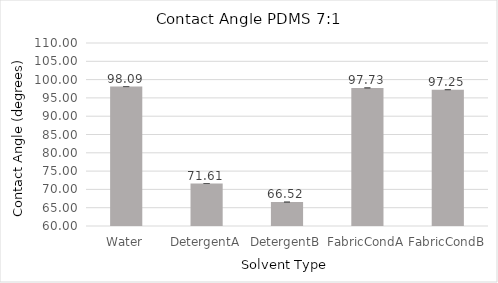
| Category | Series 0 |
|---|---|
| Water | 98.093 |
| DetergentA | 71.607 |
| DetergentB | 66.523 |
| FabricCondA | 97.733 |
| FabricCondB | 97.247 |